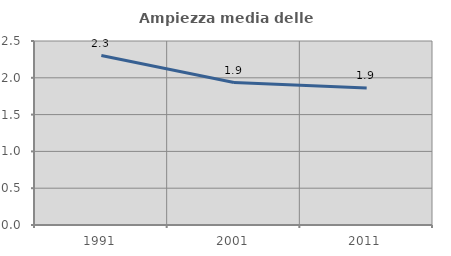
| Category | Ampiezza media delle famiglie |
|---|---|
| 1991.0 | 2.302 |
| 2001.0 | 1.935 |
| 2011.0 | 1.862 |